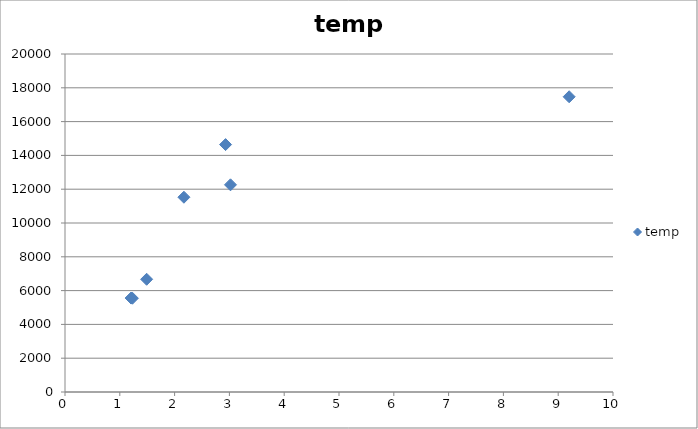
| Category | temp |
|---|---|
| 1.206 | 5560 |
| 1.23 | 5549 |
| 1.49 | 6670 |
| 2.17 | 11525 |
| 2.93 | 14640 |
| 3.02 | 12260 |
| 9.2 | 17470 |